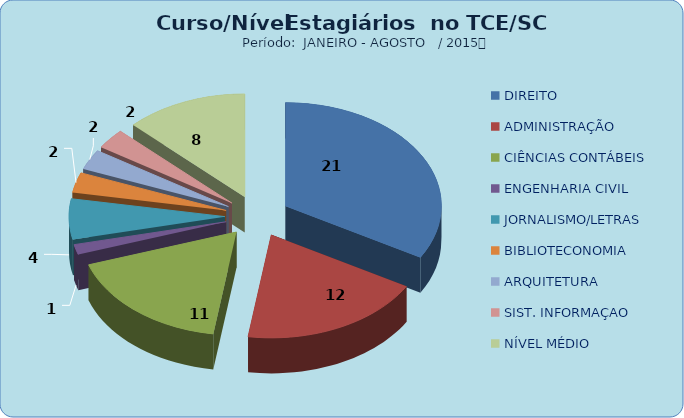
| Category | Series 0 |
|---|---|
| DIREITO | 21 |
| ADMINISTRAÇÃO | 12 |
| CIÊNCIAS CONTÁBEIS | 11 |
| ENGENHARIA CIVIL | 1 |
| JORNALISMO/LETRAS | 4 |
| BIBLIOTECONOMIA | 2 |
| ARQUITETURA | 2 |
| SIST. INFORMAÇAO | 2 |
| NÍVEL MÉDIO | 8 |